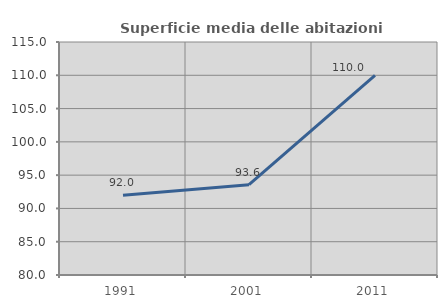
| Category | Superficie media delle abitazioni occupate |
|---|---|
| 1991.0 | 91.987 |
| 2001.0 | 93.567 |
| 2011.0 | 110.001 |